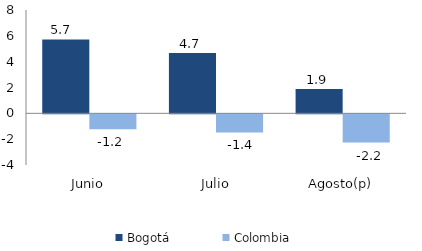
| Category | Bogotá | Colombia |
|---|---|---|
| Junio | 5.724 | -1.162 |
| Julio | 4.678 | -1.4 |
| Agosto(p) | 1.875 | -2.185 |